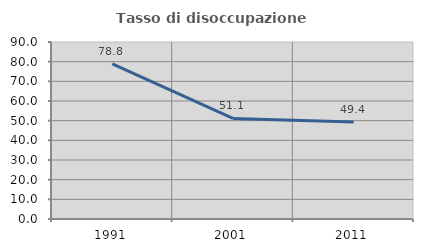
| Category | Tasso di disoccupazione giovanile  |
|---|---|
| 1991.0 | 78.829 |
| 2001.0 | 51.111 |
| 2011.0 | 49.367 |